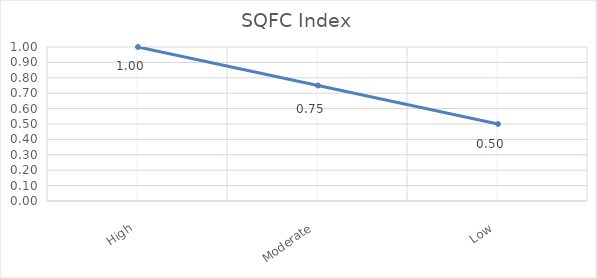
| Category | SQFC Index |
|---|---|
| High | 1 |
| Moderate | 0.75 |
| Low | 0.5 |